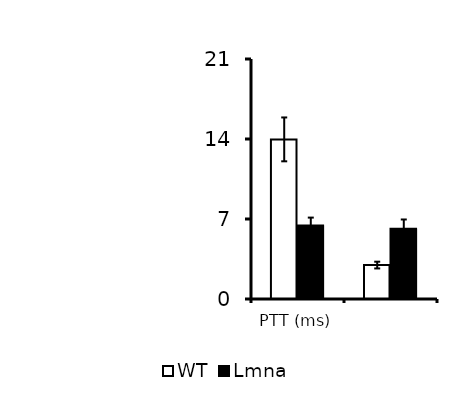
| Category | WT | Lmna |
|---|---|---|
| PTT (ms) | 13.967 | 6.442 |
| PWV (m/s) | 2.969 | 6.157 |